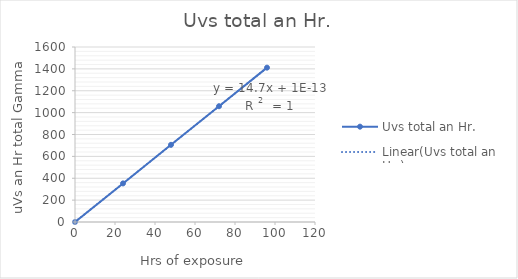
| Category | Uvs total an Hr. |
|---|---|
| 0.0 | 0 |
| 24.0 | 352.8 |
| 48.0 | 705.6 |
| 72.0 | 1058.4 |
| 96.0 | 1411.2 |